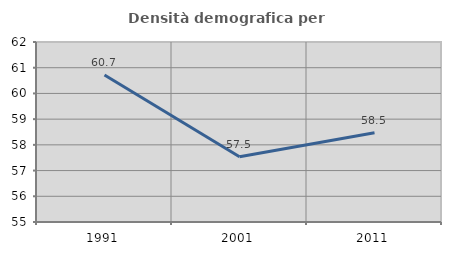
| Category | Densità demografica |
|---|---|
| 1991.0 | 60.716 |
| 2001.0 | 57.535 |
| 2011.0 | 58.473 |